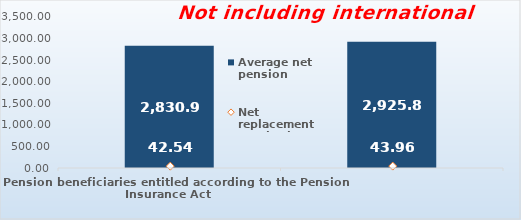
| Category | Average net pension  |
|---|---|
| Pension beneficiaries entitled according to the Pension Insurance Act   | 2830.95 |
| Pension beneficiaries entitled to pension FOR THE FIRST TIME in 2020 according to the Pension Insurance Act  - NEW BENEFICIARIES | 2925.796 |